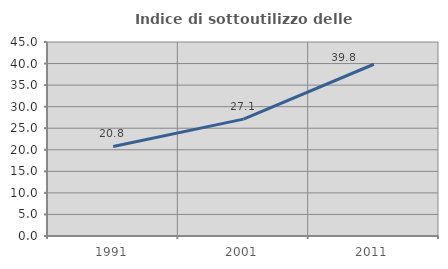
| Category | Indice di sottoutilizzo delle abitazioni  |
|---|---|
| 1991.0 | 20.763 |
| 2001.0 | 27.117 |
| 2011.0 | 39.841 |